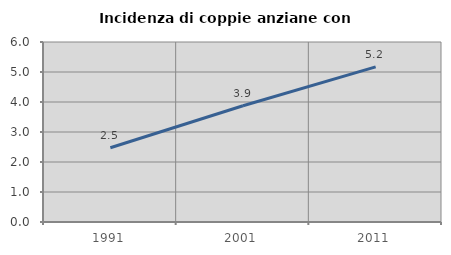
| Category | Incidenza di coppie anziane con figli |
|---|---|
| 1991.0 | 2.474 |
| 2001.0 | 3.876 |
| 2011.0 | 5.171 |